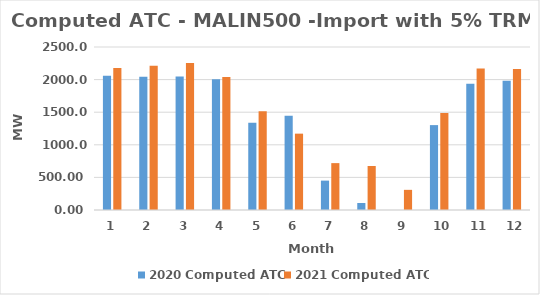
| Category | 2020 Computed ATC | 2021 Computed ATC |
|---|---|---|
| 0 | 2058 | 2178 |
| 1 | 2045 | 2211 |
| 2 | 2047.22 | 2253 |
| 3 | 2007 | 2041 |
| 4 | 1337 | 1514 |
| 5 | 1445 | 1171 |
| 6 | 450.72 | 719.04 |
| 7 | 107.25 | 675.04 |
| 8 | 0 | 309.1 |
| 9 | 1302 | 1486.34 |
| 10 | 1936 | 2169 |
| 11 | 1984 | 2163.24 |